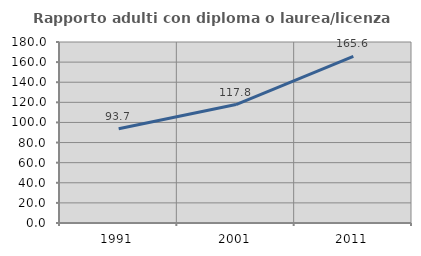
| Category | Rapporto adulti con diploma o laurea/licenza media  |
|---|---|
| 1991.0 | 93.651 |
| 2001.0 | 117.808 |
| 2011.0 | 165.608 |